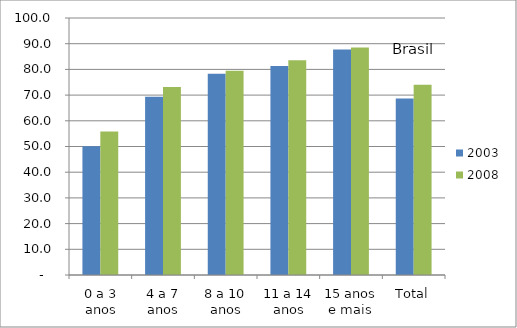
| Category | 2003 | 2008 |
|---|---|---|
| 0 a 3 anos | 50.08 | 55.84 |
| 4 a 7 anos | 69.37 | 73.13 |
| 8 a 10 anos | 78.28 | 79.5 |
| 11 a 14 anos | 81.32 | 83.56 |
| 15 anos e mais | 87.71 | 88.51 |
| Total | 68.67 | 74 |